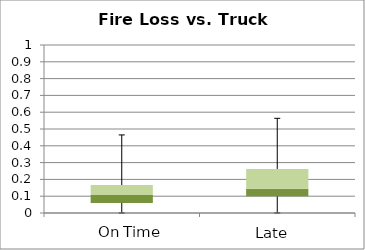
| Category | 1st Quartile | Median | 3rd Quartile |
|---|---|---|---|
| 0 | 0.06 | 0.047 | 0.059 |
| 1 | 0.099 | 0.046 | 0.117 |